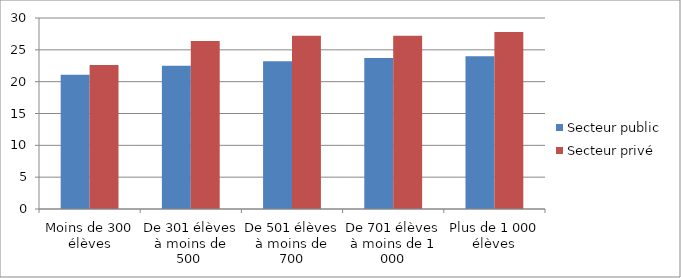
| Category | Secteur public | Secteur privé |
|---|---|---|
| Moins de 300 élèves | 21.1 | 22.6 |
| De 301 élèves à moins de 500  | 22.5 | 26.4 |
| De 501 élèves à moins de 700 | 23.2 | 27.2 |
| De 701 élèves à moins de 1 000 | 23.7 | 27.2 |
| Plus de 1 000 élèves | 24 | 27.8 |